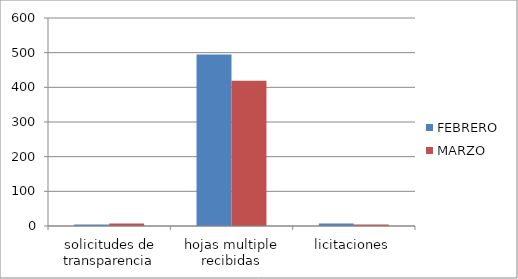
| Category | FEBRERO | MARZO |
|---|---|---|
| solicitudes de transparencia | 4 | 7 |
| hojas multiple recibidas | 495 | 419 |
| licitaciones | 7 | 4 |